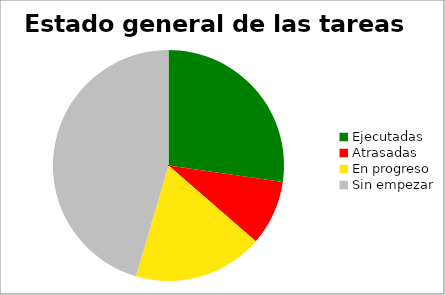
| Category | Series 0 |
|---|---|
| Ejecutadas | 0.273 |
| Atrasadas | 0.091 |
| En progreso | 0.182 |
| Sin empezar | 0.455 |